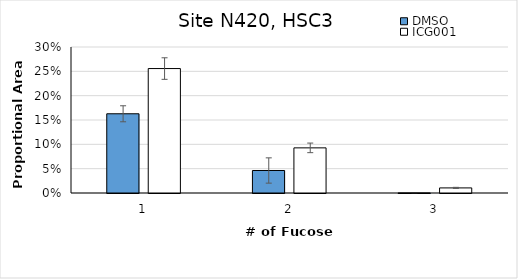
| Category | DMSO | ICG001 |
|---|---|---|
| 0 | 0.163 | 0.256 |
| 1 | 0.046 | 0.093 |
| 2 | 0 | 0.01 |